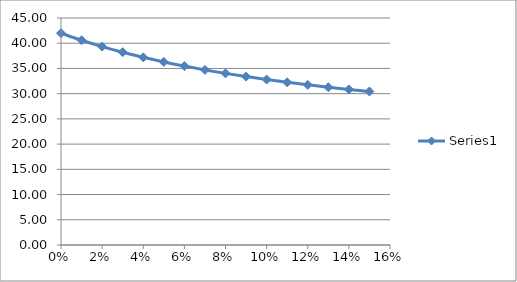
| Category | Series 0 |
|---|---|
| 0.0 | 42 |
| 0.01 | 40.588 |
| 0.02 | 39.334 |
| 0.03 | 38.214 |
| 0.04 | 37.206 |
| 0.05 | 36.295 |
| 0.06 | 35.467 |
| 0.07 | 34.712 |
| 0.08 | 34.02 |
| 0.09 | 33.383 |
| 0.1 | 32.796 |
| 0.11 | 32.253 |
| 0.12 | 31.749 |
| 0.13 | 31.279 |
| 0.14 | 30.841 |
| 0.15 | 30.432 |